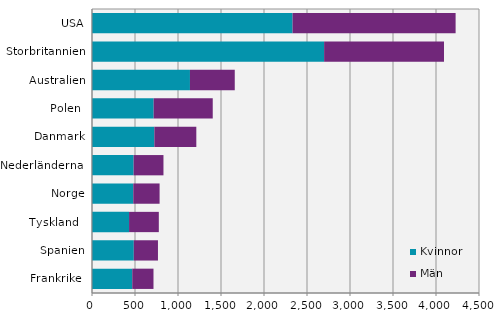
| Category | Kvinnor | Män |
|---|---|---|
| USA | 2332 | 1896 |
| Storbritannien | 2699 | 1394 |
| Australien | 1139 | 521 |
| Polen  | 717 | 687 |
| Danmark | 725 | 488 |
| Nederländerna  | 484 | 347 |
| Norge | 480 | 306 |
| Tyskland   | 431 | 346 |
| Spanien | 486 | 281 |
| Frankrike  | 468 | 247 |